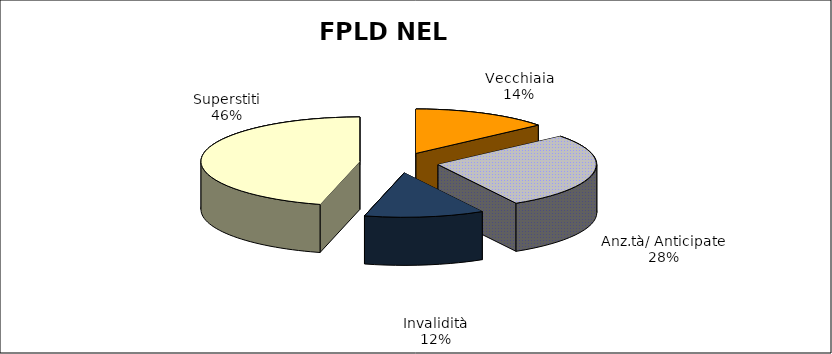
| Category | Series 0 |
|---|---|
| Vecchiaia | 25227 |
| Anz.tà/ Anticipate | 50148 |
| Invalidità | 21993 |
| Superstiti | 82853 |